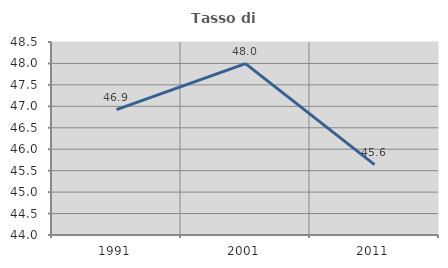
| Category | Tasso di occupazione   |
|---|---|
| 1991.0 | 46.924 |
| 2001.0 | 47.996 |
| 2011.0 | 45.641 |